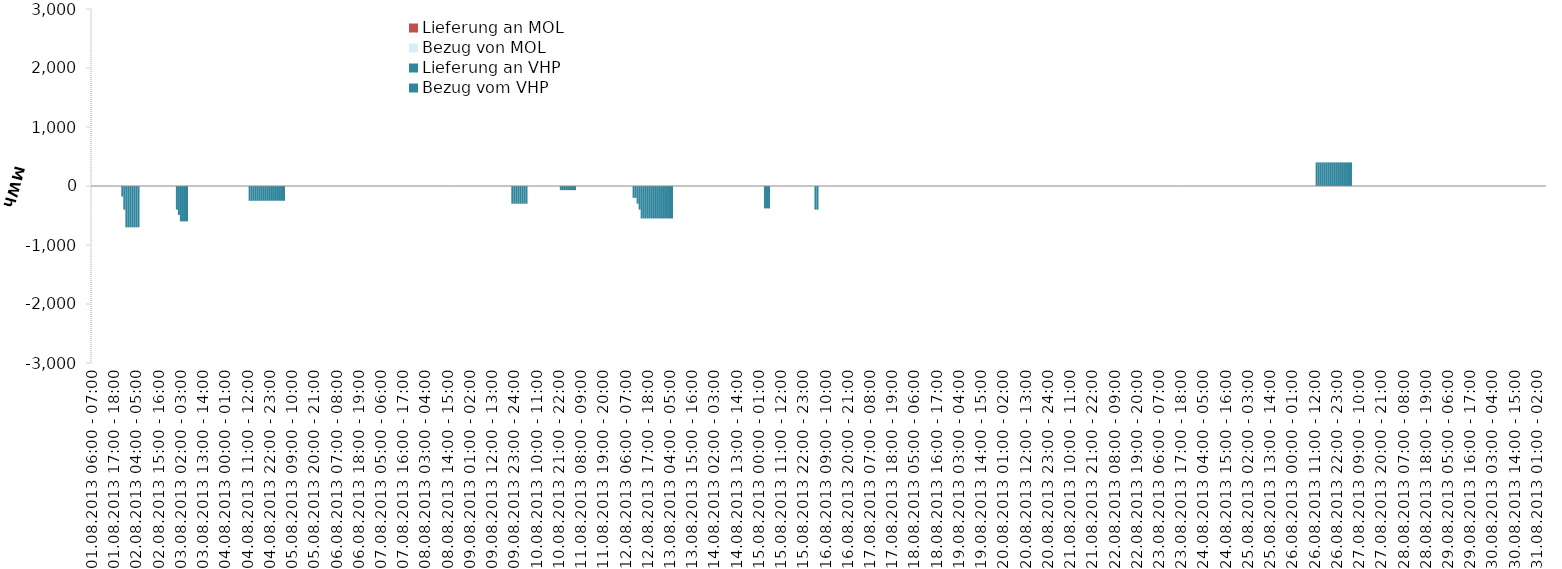
| Category | Bezug vom VHP | Lieferung an VHP | Bezug von MOL | Lieferung an MOL |
|---|---|---|---|---|
| 01.08.2013 06:00 - 07:00 | 0 | 0 | 0 | 0 |
| 01.08.2013 07:00 - 08:00 | 0 | 0 | 0 | 0 |
| 01.08.2013 08:00 - 09:00 | 0 | 0 | 0 | 0 |
| 01.08.2013 09:00 - 10:00 | 0 | 0 | 0 | 0 |
| 01.08.2013 10:00 - 11:00 | 0 | 0 | 0 | 0 |
| 01.08.2013 11:00 - 12:00 | 0 | 0 | 0 | 0 |
| 01.08.2013 12:00 - 13:00 | 0 | 0 | 0 | 0 |
| 01.08.2013 13:00 - 14:00 | 0 | 0 | 0 | 0 |
| 01.08.2013 14:00 - 15:00 | 0 | 0 | 0 | 0 |
| 01.08.2013 15:00 - 16:00 | 0 | 0 | 0 | 0 |
| 01.08.2013 16:00 - 17:00 | 0 | 0 | 0 | 0 |
| 01.08.2013 17:00 - 18:00 | 0 | 0 | 0 | 0 |
| 01.08.2013 18:00 - 19:00 | 0 | 0 | 0 | 0 |
| 01.08.2013 19:00 - 20:00 | 0 | 0 | 0 | 0 |
| 01.08.2013 20:00 - 21:00 | 0 | 0 | 0 | 0 |
| 01.08.2013 21:00 - 22:00 | 0 | -180 | 0 | 0 |
| 01.08.2013 22:00 - 23:00 | 0 | -400 | 0 | 0 |
| 01.08.2013 23:00 - 24:00 | 0 | -700 | 0 | 0 |
| 02.08.2013 00:00 - 01:00 | 0 | -700 | 0 | 0 |
| 02.08.2013 01:00 - 02:00 | 0 | -700 | 0 | 0 |
| 02.08.2013 02:00 - 03:00 | 0 | -700 | 0 | 0 |
| 02.08.2013 03:00 - 04:00 | 0 | -700 | 0 | 0 |
| 02.08.2013 04:00 - 05:00 | 0 | -700 | 0 | 0 |
| 02.08.2013 05:00 - 06:00 | 0 | -700 | 0 | 0 |
| 02.08.2013 06:00 - 07:00 | 0 | 0 | 0 | 0 |
| 02.08.2013 07:00 - 08:00 | 0 | 0 | 0 | 0 |
| 02.08.2013 08:00 - 09:00 | 0 | 0 | 0 | 0 |
| 02.08.2013 09:00 - 10:00 | 0 | 0 | 0 | 0 |
| 02.08.2013 10:00 - 11:00 | 0 | 0 | 0 | 0 |
| 02.08.2013 11:00 - 12:00 | 0 | 0 | 0 | 0 |
| 02.08.2013 12:00 - 13:00 | 0 | 0 | 0 | 0 |
| 02.08.2013 13:00 - 14:00 | 0 | 0 | 0 | 0 |
| 02.08.2013 14:00 - 15:00 | 0 | 0 | 0 | 0 |
| 02.08.2013 15:00 - 16:00 | 0 | 0 | 0 | 0 |
| 02.08.2013 16:00 - 17:00 | 0 | 0 | 0 | 0 |
| 02.08.2013 17:00 - 18:00 | 0 | 0 | 0 | 0 |
| 02.08.2013 18:00 - 19:00 | 0 | 0 | 0 | 0 |
| 02.08.2013 19:00 - 20:00 | 0 | 0 | 0 | 0 |
| 02.08.2013 20:00 - 21:00 | 0 | 0 | 0 | 0 |
| 02.08.2013 21:00 - 22:00 | 0 | 0 | 0 | 0 |
| 02.08.2013 22:00 - 23:00 | 0 | 0 | 0 | 0 |
| 02.08.2013 23:00 - 24:00 | 0 | 0 | 0 | 0 |
| 03.08.2013 00:00 - 01:00 | 0 | -400 | 0 | 0 |
| 03.08.2013 01:00 - 02:00 | 0 | -490 | 0 | 0 |
| 03.08.2013 02:00 - 03:00 | 0 | -600 | 0 | 0 |
| 03.08.2013 03:00 - 04:00 | 0 | -600 | 0 | 0 |
| 03.08.2013 04:00 - 05:00 | 0 | -600 | 0 | 0 |
| 03.08.2013 05:00 - 06:00 | 0 | -600 | 0 | 0 |
| 03.08.2013 06:00 - 07:00 | 0 | 0 | 0 | 0 |
| 03.08.2013 07:00 - 08:00 | 0 | 0 | 0 | 0 |
| 03.08.2013 08:00 - 09:00 | 0 | 0 | 0 | 0 |
| 03.08.2013 09:00 - 10:00 | 0 | 0 | 0 | 0 |
| 03.08.2013 10:00 - 11:00 | 0 | 0 | 0 | 0 |
| 03.08.2013 11:00 - 12:00 | 0 | 0 | 0 | 0 |
| 03.08.2013 12:00 - 13:00 | 0 | 0 | 0 | 0 |
| 03.08.2013 13:00 - 14:00 | 0 | 0 | 0 | 0 |
| 03.08.2013 14:00 - 15:00 | 0 | 0 | 0 | 0 |
| 03.08.2013 15:00 - 16:00 | 0 | 0 | 0 | 0 |
| 03.08.2013 16:00 - 17:00 | 0 | 0 | 0 | 0 |
| 03.08.2013 17:00 - 18:00 | 0 | 0 | 0 | 0 |
| 03.08.2013 18:00 - 19:00 | 0 | 0 | 0 | 0 |
| 03.08.2013 19:00 - 20:00 | 0 | 0 | 0 | 0 |
| 03.08.2013 20:00 - 21:00 | 0 | 0 | 0 | 0 |
| 03.08.2013 21:00 - 22:00 | 0 | 0 | 0 | 0 |
| 03.08.2013 22:00 - 23:00 | 0 | 0 | 0 | 0 |
| 03.08.2013 23:00 - 24:00 | 0 | 0 | 0 | 0 |
| 04.08.2013 00:00 - 01:00 | 0 | 0 | 0 | 0 |
| 04.08.2013 01:00 - 02:00 | 0 | 0 | 0 | 0 |
| 04.08.2013 02:00 - 03:00 | 0 | 0 | 0 | 0 |
| 04.08.2013 03:00 - 04:00 | 0 | 0 | 0 | 0 |
| 04.08.2013 04:00 - 05:00 | 0 | 0 | 0 | 0 |
| 04.08.2013 05:00 - 06:00 | 0 | 0 | 0 | 0 |
| 04.08.2013 06:00 - 07:00 | 0 | 0 | 0 | 0 |
| 04.08.2013 07:00 - 08:00 | 0 | 0 | 0 | 0 |
| 04.08.2013 08:00 - 09:00 | 0 | 0 | 0 | 0 |
| 04.08.2013 09:00 - 10:00 | 0 | 0 | 0 | 0 |
| 04.08.2013 10:00 - 11:00 | 0 | 0 | 0 | 0 |
| 04.08.2013 11:00 - 12:00 | 0 | 0 | 0 | 0 |
| 04.08.2013 12:00 - 13:00 | 0 | -250 | 0 | 0 |
| 04.08.2013 13:00 - 14:00 | 0 | -250 | 0 | 0 |
| 04.08.2013 14:00 - 15:00 | 0 | -250 | 0 | 0 |
| 04.08.2013 15:00 - 16:00 | 0 | -250 | 0 | 0 |
| 04.08.2013 16:00 - 17:00 | 0 | -250 | 0 | 0 |
| 04.08.2013 17:00 - 18:00 | 0 | -250 | 0 | 0 |
| 04.08.2013 18:00 - 19:00 | 0 | -250 | 0 | 0 |
| 04.08.2013 19:00 - 20:00 | 0 | -250 | 0 | 0 |
| 04.08.2013 20:00 - 21:00 | 0 | -250 | 0 | 0 |
| 04.08.2013 21:00 - 22:00 | 0 | -250 | 0 | 0 |
| 04.08.2013 22:00 - 23:00 | 0 | -250 | 0 | 0 |
| 04.08.2013 23:00 - 24:00 | 0 | -250 | 0 | 0 |
| 05.08.2013 00:00 - 01:00 | 0 | -250 | 0 | 0 |
| 05.08.2013 01:00 - 02:00 | 0 | -250 | 0 | 0 |
| 05.08.2013 02:00 - 03:00 | 0 | -250 | 0 | 0 |
| 05.08.2013 03:00 - 04:00 | 0 | -250 | 0 | 0 |
| 05.08.2013 04:00 - 05:00 | 0 | -250 | 0 | 0 |
| 05.08.2013 05:00 - 06:00 | 0 | -250 | 0 | 0 |
| 05.08.2013 06:00 - 07:00 | 0 | 0 | 0 | 0 |
| 05.08.2013 07:00 - 08:00 | 0 | 0 | 0 | 0 |
| 05.08.2013 08:00 - 09:00 | 0 | 0 | 0 | 0 |
| 05.08.2013 09:00 - 10:00 | 0 | 0 | 0 | 0 |
| 05.08.2013 10:00 - 11:00 | 0 | 0 | 0 | 0 |
| 05.08.2013 11:00 - 12:00 | 0 | 0 | 0 | 0 |
| 05.08.2013 12:00 - 13:00 | 0 | 0 | 0 | 0 |
| 05.08.2013 13:00 - 14:00 | 0 | 0 | 0 | 0 |
| 05.08.2013 14:00 - 15:00 | 0 | 0 | 0 | 0 |
| 05.08.2013 15:00 - 16:00 | 0 | 0 | 0 | 0 |
| 05.08.2013 16:00 - 17:00 | 0 | 0 | 0 | 0 |
| 05.08.2013 17:00 - 18:00 | 0 | 0 | 0 | 0 |
| 05.08.2013 18:00 - 19:00 | 0 | 0 | 0 | 0 |
| 05.08.2013 19:00 - 20:00 | 0 | 0 | 0 | 0 |
| 05.08.2013 20:00 - 21:00 | 0 | 0 | 0 | 0 |
| 05.08.2013 21:00 - 22:00 | 0 | 0 | 0 | 0 |
| 05.08.2013 22:00 - 23:00 | 0 | 0 | 0 | 0 |
| 05.08.2013 23:00 - 24:00 | 0 | 0 | 0 | 0 |
| 06.08.2013 00:00 - 01:00 | 0 | 0 | 0 | 0 |
| 06.08.2013 01:00 - 02:00 | 0 | 0 | 0 | 0 |
| 06.08.2013 02:00 - 03:00 | 0 | 0 | 0 | 0 |
| 06.08.2013 03:00 - 04:00 | 0 | 0 | 0 | 0 |
| 06.08.2013 04:00 - 05:00 | 0 | 0 | 0 | 0 |
| 06.08.2013 05:00 - 06:00 | 0 | 0 | 0 | 0 |
| 06.08.2013 06:00 - 07:00 | 0 | 0 | 0 | 0 |
| 06.08.2013 07:00 - 08:00 | 0 | 0 | 0 | 0 |
| 06.08.2013 08:00 - 09:00 | 0 | 0 | 0 | 0 |
| 06.08.2013 09:00 - 10:00 | 0 | 0 | 0 | 0 |
| 06.08.2013 10:00 - 11:00 | 0 | 0 | 0 | 0 |
| 06.08.2013 11:00 - 12:00 | 0 | 0 | 0 | 0 |
| 06.08.2013 12:00 - 13:00 | 0 | 0 | 0 | 0 |
| 06.08.2013 13:00 - 14:00 | 0 | 0 | 0 | 0 |
| 06.08.2013 14:00 - 15:00 | 0 | 0 | 0 | 0 |
| 06.08.2013 15:00 - 16:00 | 0 | 0 | 0 | 0 |
| 06.08.2013 16:00 - 17:00 | 0 | 0 | 0 | 0 |
| 06.08.2013 17:00 - 18:00 | 0 | 0 | 0 | 0 |
| 06.08.2013 18:00 - 19:00 | 0 | 0 | 0 | 0 |
| 06.08.2013 19:00 - 20:00 | 0 | 0 | 0 | 0 |
| 06.08.2013 20:00 - 21:00 | 0 | 0 | 0 | 0 |
| 06.08.2013 21:00 - 22:00 | 0 | 0 | 0 | 0 |
| 06.08.2013 22:00 - 23:00 | 0 | 0 | 0 | 0 |
| 06.08.2013 23:00 - 24:00 | 0 | 0 | 0 | 0 |
| 07.08.2013 00:00 - 01:00 | 0 | 0 | 0 | 0 |
| 07.08.2013 01:00 - 02:00 | 0 | 0 | 0 | 0 |
| 07.08.2013 02:00 - 03:00 | 0 | 0 | 0 | 0 |
| 07.08.2013 03:00 - 04:00 | 0 | 0 | 0 | 0 |
| 07.08.2013 04:00 - 05:00 | 0 | 0 | 0 | 0 |
| 07.08.2013 05:00 - 06:00 | 0 | 0 | 0 | 0 |
| 07.08.2013 06:00 - 07:00 | 0 | 0 | 0 | 0 |
| 07.08.2013 07:00 - 08:00 | 0 | 0 | 0 | 0 |
| 07.08.2013 08:00 - 09:00 | 0 | 0 | 0 | 0 |
| 07.08.2013 09:00 - 10:00 | 0 | 0 | 0 | 0 |
| 07.08.2013 10:00 - 11:00 | 0 | 0 | 0 | 0 |
| 07.08.2013 11:00 - 12:00 | 0 | 0 | 0 | 0 |
| 07.08.2013 12:00 - 13:00 | 0 | 0 | 0 | 0 |
| 07.08.2013 13:00 - 14:00 | 0 | 0 | 0 | 0 |
| 07.08.2013 14:00 - 15:00 | 0 | 0 | 0 | 0 |
| 07.08.2013 15:00 - 16:00 | 0 | 0 | 0 | 0 |
| 07.08.2013 16:00 - 17:00 | 0 | 0 | 0 | 0 |
| 07.08.2013 17:00 - 18:00 | 0 | 0 | 0 | 0 |
| 07.08.2013 18:00 - 19:00 | 0 | 0 | 0 | 0 |
| 07.08.2013 19:00 - 20:00 | 0 | 0 | 0 | 0 |
| 07.08.2013 20:00 - 21:00 | 0 | 0 | 0 | 0 |
| 07.08.2013 21:00 - 22:00 | 0 | 0 | 0 | 0 |
| 07.08.2013 22:00 - 23:00 | 0 | 0 | 0 | 0 |
| 07.08.2013 23:00 - 24:00 | 0 | 0 | 0 | 0 |
| 08.08.2013 00:00 - 01:00 | 0 | 0 | 0 | 0 |
| 08.08.2013 01:00 - 02:00 | 0 | 0 | 0 | 0 |
| 08.08.2013 02:00 - 03:00 | 0 | 0 | 0 | 0 |
| 08.08.2013 03:00 - 04:00 | 0 | 0 | 0 | 0 |
| 08.08.2013 04:00 - 05:00 | 0 | 0 | 0 | 0 |
| 08.08.2013 05:00 - 06:00 | 0 | 0 | 0 | 0 |
| 08.08.2013 06:00 - 07:00 | 0 | 0 | 0 | 0 |
| 08.08.2013 07:00 - 08:00 | 0 | 0 | 0 | 0 |
| 08.08.2013 08:00 - 09:00 | 0 | 0 | 0 | 0 |
| 08.08.2013 09:00 - 10:00 | 0 | 0 | 0 | 0 |
| 08.08.2013 10:00 - 11:00 | 0 | 0 | 0 | 0 |
| 08.08.2013 11:00 - 12:00 | 0 | 0 | 0 | 0 |
| 08.08.2013 12:00 - 13:00 | 0 | 0 | 0 | 0 |
| 08.08.2013 13:00 - 14:00 | 0 | 0 | 0 | 0 |
| 08.08.2013 14:00 - 15:00 | 0 | 0 | 0 | 0 |
| 08.08.2013 15:00 - 16:00 | 0 | 0 | 0 | 0 |
| 08.08.2013 16:00 - 17:00 | 0 | 0 | 0 | 0 |
| 08.08.2013 17:00 - 18:00 | 0 | 0 | 0 | 0 |
| 08.08.2013 18:00 - 19:00 | 0 | 0 | 0 | 0 |
| 08.08.2013 19:00 - 20:00 | 0 | 0 | 0 | 0 |
| 08.08.2013 20:00 - 21:00 | 0 | 0 | 0 | 0 |
| 08.08.2013 21:00 - 22:00 | 0 | 0 | 0 | 0 |
| 08.08.2013 22:00 - 23:00 | 0 | 0 | 0 | 0 |
| 08.08.2013 23:00 - 24:00 | 0 | 0 | 0 | 0 |
| 09.08.2013 00:00 - 01:00 | 0 | 0 | 0 | 0 |
| 09.08.2013 01:00 - 02:00 | 0 | 0 | 0 | 0 |
| 09.08.2013 02:00 - 03:00 | 0 | 0 | 0 | 0 |
| 09.08.2013 03:00 - 04:00 | 0 | 0 | 0 | 0 |
| 09.08.2013 04:00 - 05:00 | 0 | 0 | 0 | 0 |
| 09.08.2013 05:00 - 06:00 | 0 | 0 | 0 | 0 |
| 09.08.2013 06:00 - 07:00 | 0 | 0 | 0 | 0 |
| 09.08.2013 07:00 - 08:00 | 0 | 0 | 0 | 0 |
| 09.08.2013 08:00 - 09:00 | 0 | 0 | 0 | 0 |
| 09.08.2013 09:00 - 10:00 | 0 | 0 | 0 | 0 |
| 09.08.2013 10:00 - 11:00 | 0 | 0 | 0 | 0 |
| 09.08.2013 11:00 - 12:00 | 0 | 0 | 0 | 0 |
| 09.08.2013 12:00 - 13:00 | 0 | 0 | 0 | 0 |
| 09.08.2013 13:00 - 14:00 | 0 | 0 | 0 | 0 |
| 09.08.2013 14:00 - 15:00 | 0 | 0 | 0 | 0 |
| 09.08.2013 15:00 - 16:00 | 0 | 0 | 0 | 0 |
| 09.08.2013 16:00 - 17:00 | 0 | 0 | 0 | 0 |
| 09.08.2013 17:00 - 18:00 | 0 | 0 | 0 | 0 |
| 09.08.2013 18:00 - 19:00 | 0 | 0 | 0 | 0 |
| 09.08.2013 19:00 - 20:00 | 0 | 0 | 0 | 0 |
| 09.08.2013 20:00 - 21:00 | 0 | 0 | 0 | 0 |
| 09.08.2013 21:00 - 22:00 | 0 | 0 | 0 | 0 |
| 09.08.2013 22:00 - 23:00 | 0 | -300 | 0 | 0 |
| 09.08.2013 23:00 - 24:00 | 0 | -300 | 0 | 0 |
| 10.08.2013 00:00 - 01:00 | 0 | -300 | 0 | 0 |
| 10.08.2013 01:00 - 02:00 | 0 | -300 | 0 | 0 |
| 10.08.2013 02:00 - 03:00 | 0 | -300 | 0 | 0 |
| 10.08.2013 03:00 - 04:00 | 0 | -300 | 0 | 0 |
| 10.08.2013 04:00 - 05:00 | 0 | -300 | 0 | 0 |
| 10.08.2013 05:00 - 06:00 | 0 | -300 | 0 | 0 |
| 10.08.2013 06:00 - 07:00 | 0 | 0 | 0 | 0 |
| 10.08.2013 07:00 - 08:00 | 0 | 0 | 0 | 0 |
| 10.08.2013 08:00 - 09:00 | 0 | 0 | 0 | 0 |
| 10.08.2013 09:00 - 10:00 | 0 | 0 | 0 | 0 |
| 10.08.2013 10:00 - 11:00 | 0 | 0 | 0 | 0 |
| 10.08.2013 11:00 - 12:00 | 0 | 0 | 0 | 0 |
| 10.08.2013 12:00 - 13:00 | 0 | 0 | 0 | 0 |
| 10.08.2013 13:00 - 14:00 | 0 | 0 | 0 | 0 |
| 10.08.2013 14:00 - 15:00 | 0 | 0 | 0 | 0 |
| 10.08.2013 15:00 - 16:00 | 0 | 0 | 0 | 0 |
| 10.08.2013 16:00 - 17:00 | 0 | 0 | 0 | 0 |
| 10.08.2013 17:00 - 18:00 | 0 | 0 | 0 | 0 |
| 10.08.2013 18:00 - 19:00 | 0 | 0 | 0 | 0 |
| 10.08.2013 19:00 - 20:00 | 0 | 0 | 0 | 0 |
| 10.08.2013 20:00 - 21:00 | 0 | 0 | 0 | 0 |
| 10.08.2013 21:00 - 22:00 | 0 | 0 | 0 | 0 |
| 10.08.2013 22:00 - 23:00 | 0 | -70 | 0 | 0 |
| 10.08.2013 23:00 - 24:00 | 0 | -70 | 0 | 0 |
| 11.08.2013 00:00 - 01:00 | 0 | -70 | 0 | 0 |
| 11.08.2013 01:00 - 02:00 | 0 | -70 | 0 | 0 |
| 11.08.2013 02:00 - 03:00 | 0 | -70 | 0 | 0 |
| 11.08.2013 03:00 - 04:00 | 0 | -70 | 0 | 0 |
| 11.08.2013 04:00 - 05:00 | 0 | -70 | 0 | 0 |
| 11.08.2013 05:00 - 06:00 | 0 | -70 | 0 | 0 |
| 11.08.2013 06:00 - 07:00 | 0 | 0 | 0 | 0 |
| 11.08.2013 07:00 - 08:00 | 0 | 0 | 0 | 0 |
| 11.08.2013 08:00 - 09:00 | 0 | 0 | 0 | 0 |
| 11.08.2013 09:00 - 10:00 | 0 | 0 | 0 | 0 |
| 11.08.2013 10:00 - 11:00 | 0 | 0 | 0 | 0 |
| 11.08.2013 11:00 - 12:00 | 0 | 0 | 0 | 0 |
| 11.08.2013 12:00 - 13:00 | 0 | 0 | 0 | 0 |
| 11.08.2013 13:00 - 14:00 | 0 | 0 | 0 | 0 |
| 11.08.2013 14:00 - 15:00 | 0 | 0 | 0 | 0 |
| 11.08.2013 15:00 - 16:00 | 0 | 0 | 0 | 0 |
| 11.08.2013 16:00 - 17:00 | 0 | 0 | 0 | 0 |
| 11.08.2013 17:00 - 18:00 | 0 | 0 | 0 | 0 |
| 11.08.2013 18:00 - 19:00 | 0 | 0 | 0 | 0 |
| 11.08.2013 19:00 - 20:00 | 0 | 0 | 0 | 0 |
| 11.08.2013 20:00 - 21:00 | 0 | 0 | 0 | 0 |
| 11.08.2013 21:00 - 22:00 | 0 | 0 | 0 | 0 |
| 11.08.2013 22:00 - 23:00 | 0 | 0 | 0 | 0 |
| 11.08.2013 23:00 - 24:00 | 0 | 0 | 0 | 0 |
| 12.08.2013 00:00 - 01:00 | 0 | 0 | 0 | 0 |
| 12.08.2013 01:00 - 02:00 | 0 | 0 | 0 | 0 |
| 12.08.2013 02:00 - 03:00 | 0 | 0 | 0 | 0 |
| 12.08.2013 03:00 - 04:00 | 0 | 0 | 0 | 0 |
| 12.08.2013 04:00 - 05:00 | 0 | 0 | 0 | 0 |
| 12.08.2013 05:00 - 06:00 | 0 | 0 | 0 | 0 |
| 12.08.2013 06:00 - 07:00 | 0 | 0 | 0 | 0 |
| 12.08.2013 07:00 - 08:00 | 0 | 0 | 0 | 0 |
| 12.08.2013 08:00 - 09:00 | 0 | 0 | 0 | 0 |
| 12.08.2013 09:00 - 10:00 | 0 | 0 | 0 | 0 |
| 12.08.2013 10:00 - 11:00 | 0 | -200 | 0 | 0 |
| 12.08.2013 11:00 - 12:00 | 0 | -200 | 0 | 0 |
| 12.08.2013 12:00 - 13:00 | 0 | -300 | 0 | 0 |
| 12.08.2013 13:00 - 14:00 | 0 | -400 | 0 | 0 |
| 12.08.2013 14:00 - 15:00 | 0 | -550 | 0 | 0 |
| 12.08.2013 15:00 - 16:00 | 0 | -550 | 0 | 0 |
| 12.08.2013 16:00 - 17:00 | 0 | -550 | 0 | 0 |
| 12.08.2013 17:00 - 18:00 | 0 | -550 | 0 | 0 |
| 12.08.2013 18:00 - 19:00 | 0 | -550 | 0 | 0 |
| 12.08.2013 19:00 - 20:00 | 0 | -550 | 0 | 0 |
| 12.08.2013 20:00 - 21:00 | 0 | -550 | 0 | 0 |
| 12.08.2013 21:00 - 22:00 | 0 | -550 | 0 | 0 |
| 12.08.2013 22:00 - 23:00 | 0 | -550 | 0 | 0 |
| 12.08.2013 23:00 - 24:00 | 0 | -550 | 0 | 0 |
| 13.08.2013 00:00 - 01:00 | 0 | -550 | 0 | 0 |
| 13.08.2013 01:00 - 02:00 | 0 | -550 | 0 | 0 |
| 13.08.2013 02:00 - 03:00 | 0 | -550 | 0 | 0 |
| 13.08.2013 03:00 - 04:00 | 0 | -550 | 0 | 0 |
| 13.08.2013 04:00 - 05:00 | 0 | -550 | 0 | 0 |
| 13.08.2013 05:00 - 06:00 | 0 | -550 | 0 | 0 |
| 13.08.2013 06:00 - 07:00 | 0 | 0 | 0 | 0 |
| 13.08.2013 07:00 - 08:00 | 0 | 0 | 0 | 0 |
| 13.08.2013 08:00 - 09:00 | 0 | 0 | 0 | 0 |
| 13.08.2013 09:00 - 10:00 | 0 | 0 | 0 | 0 |
| 13.08.2013 10:00 - 11:00 | 0 | 0 | 0 | 0 |
| 13.08.2013 11:00 - 12:00 | 0 | 0 | 0 | 0 |
| 13.08.2013 12:00 - 13:00 | 0 | 0 | 0 | 0 |
| 13.08.2013 13:00 - 14:00 | 0 | 0 | 0 | 0 |
| 13.08.2013 14:00 - 15:00 | 0 | 0 | 0 | 0 |
| 13.08.2013 15:00 - 16:00 | 0 | 0 | 0 | 0 |
| 13.08.2013 16:00 - 17:00 | 0 | 0 | 0 | 0 |
| 13.08.2013 17:00 - 18:00 | 0 | 0 | 0 | 0 |
| 13.08.2013 18:00 - 19:00 | 0 | 0 | 0 | 0 |
| 13.08.2013 19:00 - 20:00 | 0 | 0 | 0 | 0 |
| 13.08.2013 20:00 - 21:00 | 0 | 0 | 0 | 0 |
| 13.08.2013 21:00 - 22:00 | 0 | 0 | 0 | 0 |
| 13.08.2013 22:00 - 23:00 | 0 | 0 | 0 | 0 |
| 13.08.2013 23:00 - 24:00 | 0 | 0 | 0 | 0 |
| 14.08.2013 00:00 - 01:00 | 0 | 0 | 0 | 0 |
| 14.08.2013 01:00 - 02:00 | 0 | 0 | 0 | 0 |
| 14.08.2013 02:00 - 03:00 | 0 | 0 | 0 | 0 |
| 14.08.2013 03:00 - 04:00 | 0 | 0 | 0 | 0 |
| 14.08.2013 04:00 - 05:00 | 0 | 0 | 0 | 0 |
| 14.08.2013 05:00 - 06:00 | 0 | 0 | 0 | 0 |
| 14.08.2013 06:00 - 07:00 | 0 | 0 | 0 | 0 |
| 14.08.2013 07:00 - 08:00 | 0 | 0 | 0 | 0 |
| 14.08.2013 08:00 - 09:00 | 0 | 0 | 0 | 0 |
| 14.08.2013 09:00 - 10:00 | 0 | 0 | 0 | 0 |
| 14.08.2013 10:00 - 11:00 | 0 | 0 | 0 | 0 |
| 14.08.2013 11:00 - 12:00 | 0 | 0 | 0 | 0 |
| 14.08.2013 12:00 - 13:00 | 0 | 0 | 0 | 0 |
| 14.08.2013 13:00 - 14:00 | 0 | 0 | 0 | 0 |
| 14.08.2013 14:00 - 15:00 | 0 | 0 | 0 | 0 |
| 14.08.2013 15:00 - 16:00 | 0 | 0 | 0 | 0 |
| 14.08.2013 16:00 - 17:00 | 0 | 0 | 0 | 0 |
| 14.08.2013 17:00 - 18:00 | 0 | 0 | 0 | 0 |
| 14.08.2013 18:00 - 19:00 | 0 | 0 | 0 | 0 |
| 14.08.2013 19:00 - 20:00 | 0 | 0 | 0 | 0 |
| 14.08.2013 20:00 - 21:00 | 0 | 0 | 0 | 0 |
| 14.08.2013 21:00 - 22:00 | 0 | 0 | 0 | 0 |
| 14.08.2013 22:00 - 23:00 | 0 | 0 | 0 | 0 |
| 14.08.2013 23:00 - 24:00 | 0 | 0 | 0 | 0 |
| 15.08.2013 00:00 - 01:00 | 0 | 0 | 0 | 0 |
| 15.08.2013 01:00 - 02:00 | 0 | 0 | 0 | 0 |
| 15.08.2013 02:00 - 03:00 | 0 | 0 | 0 | 0 |
| 15.08.2013 03:00 - 04:00 | 0 | -380 | 0 | 0 |
| 15.08.2013 04:00 - 05:00 | 0 | -380 | 0 | 0 |
| 15.08.2013 05:00 - 06:00 | 0 | -380 | 0 | 0 |
| 15.08.2013 06:00 - 07:00 | 0 | 0 | 0 | 0 |
| 15.08.2013 07:00 - 08:00 | 0 | 0 | 0 | 0 |
| 15.08.2013 08:00 - 09:00 | 0 | 0 | 0 | 0 |
| 15.08.2013 09:00 - 10:00 | 0 | 0 | 0 | 0 |
| 15.08.2013 10:00 - 11:00 | 0 | 0 | 0 | 0 |
| 15.08.2013 11:00 - 12:00 | 0 | 0 | 0 | 0 |
| 15.08.2013 12:00 - 13:00 | 0 | 0 | 0 | 0 |
| 15.08.2013 13:00 - 14:00 | 0 | 0 | 0 | 0 |
| 15.08.2013 14:00 - 15:00 | 0 | 0 | 0 | 0 |
| 15.08.2013 15:00 - 16:00 | 0 | 0 | 0 | 0 |
| 15.08.2013 16:00 - 17:00 | 0 | 0 | 0 | 0 |
| 15.08.2013 17:00 - 18:00 | 0 | 0 | 0 | 0 |
| 15.08.2013 18:00 - 19:00 | 0 | 0 | 0 | 0 |
| 15.08.2013 19:00 - 20:00 | 0 | 0 | 0 | 0 |
| 15.08.2013 20:00 - 21:00 | 0 | 0 | 0 | 0 |
| 15.08.2013 21:00 - 22:00 | 0 | 0 | 0 | 0 |
| 15.08.2013 22:00 - 23:00 | 0 | 0 | 0 | 0 |
| 15.08.2013 23:00 - 24:00 | 0 | 0 | 0 | 0 |
| 16.08.2013 00:00 - 01:00 | 0 | 0 | 0 | 0 |
| 16.08.2013 01:00 - 02:00 | 0 | 0 | 0 | 0 |
| 16.08.2013 02:00 - 03:00 | 0 | 0 | 0 | 0 |
| 16.08.2013 03:00 - 04:00 | 0 | 0 | 0 | 0 |
| 16.08.2013 04:00 - 05:00 | 0 | -400 | 0 | 0 |
| 16.08.2013 05:00 - 06:00 | 0 | -400 | 0 | 0 |
| 16.08.2013 06:00 - 07:00 | 0 | 0 | 0 | 0 |
| 16.08.2013 07:00 - 08:00 | 0 | 0 | 0 | 0 |
| 16.08.2013 08:00 - 09:00 | 0 | 0 | 0 | 0 |
| 16.08.2013 09:00 - 10:00 | 0 | 0 | 0 | 0 |
| 16.08.2013 10:00 - 11:00 | 0 | 0 | 0 | 0 |
| 16.08.2013 11:00 - 12:00 | 0 | 0 | 0 | 0 |
| 16.08.2013 12:00 - 13:00 | 0 | 0 | 0 | 0 |
| 16.08.2013 13:00 - 14:00 | 0 | 0 | 0 | 0 |
| 16.08.2013 14:00 - 15:00 | 0 | 0 | 0 | 0 |
| 16.08.2013 15:00 - 16:00 | 0 | 0 | 0 | 0 |
| 16.08.2013 16:00 - 17:00 | 0 | 0 | 0 | 0 |
| 16.08.2013 17:00 - 18:00 | 0 | 0 | 0 | 0 |
| 16.08.2013 18:00 - 19:00 | 0 | 0 | 0 | 0 |
| 16.08.2013 19:00 - 20:00 | 0 | 0 | 0 | 0 |
| 16.08.2013 20:00 - 21:00 | 0 | 0 | 0 | 0 |
| 16.08.2013 21:00 - 22:00 | 0 | 0 | 0 | 0 |
| 16.08.2013 22:00 - 23:00 | 0 | 0 | 0 | 0 |
| 16.08.2013 23:00 - 24:00 | 0 | 0 | 0 | 0 |
| 17.08.2013 00:00 - 01:00 | 0 | 0 | 0 | 0 |
| 17.08.2013 01:00 - 02:00 | 0 | 0 | 0 | 0 |
| 17.08.2013 02:00 - 03:00 | 0 | 0 | 0 | 0 |
| 17.08.2013 03:00 - 04:00 | 0 | 0 | 0 | 0 |
| 17.08.2013 04:00 - 05:00 | 0 | 0 | 0 | 0 |
| 17.08.2013 05:00 - 06:00 | 0 | 0 | 0 | 0 |
| 17.08.2013 06:00 - 07:00 | 0 | 0 | 0 | 0 |
| 17.08.2013 07:00 - 08:00 | 0 | 0 | 0 | 0 |
| 17.08.2013 08:00 - 09:00 | 0 | 0 | 0 | 0 |
| 17.08.2013 09:00 - 10:00 | 0 | 0 | 0 | 0 |
| 17.08.2013 10:00 - 11:00 | 0 | 0 | 0 | 0 |
| 17.08.2013 11:00 - 12:00 | 0 | 0 | 0 | 0 |
| 17.08.2013 12:00 - 13:00 | 0 | 0 | 0 | 0 |
| 17.08.2013 13:00 - 14:00 | 0 | 0 | 0 | 0 |
| 17.08.2013 14:00 - 15:00 | 0 | 0 | 0 | 0 |
| 17.08.2013 15:00 - 16:00 | 0 | 0 | 0 | 0 |
| 17.08.2013 16:00 - 17:00 | 0 | 0 | 0 | 0 |
| 17.08.2013 17:00 - 18:00 | 0 | 0 | 0 | 0 |
| 17.08.2013 18:00 - 19:00 | 0 | 0 | 0 | 0 |
| 17.08.2013 19:00 - 20:00 | 0 | 0 | 0 | 0 |
| 17.08.2013 20:00 - 21:00 | 0 | 0 | 0 | 0 |
| 17.08.2013 21:00 - 22:00 | 0 | 0 | 0 | 0 |
| 17.08.2013 22:00 - 23:00 | 0 | 0 | 0 | 0 |
| 17.08.2013 23:00 - 24:00 | 0 | 0 | 0 | 0 |
| 18.08.2013 00:00 - 01:00 | 0 | 0 | 0 | 0 |
| 18.08.2013 01:00 - 02:00 | 0 | 0 | 0 | 0 |
| 18.08.2013 02:00 - 03:00 | 0 | 0 | 0 | 0 |
| 18.08.2013 03:00 - 04:00 | 0 | 0 | 0 | 0 |
| 18.08.2013 04:00 - 05:00 | 0 | 0 | 0 | 0 |
| 18.08.2013 05:00 - 06:00 | 0 | 0 | 0 | 0 |
| 18.08.2013 06:00 - 07:00 | 0 | 0 | 0 | 0 |
| 18.08.2013 07:00 - 08:00 | 0 | 0 | 0 | 0 |
| 18.08.2013 08:00 - 09:00 | 0 | 0 | 0 | 0 |
| 18.08.2013 09:00 - 10:00 | 0 | 0 | 0 | 0 |
| 18.08.2013 10:00 - 11:00 | 0 | 0 | 0 | 0 |
| 18.08.2013 11:00 - 12:00 | 0 | 0 | 0 | 0 |
| 18.08.2013 12:00 - 13:00 | 0 | 0 | 0 | 0 |
| 18.08.2013 13:00 - 14:00 | 0 | 0 | 0 | 0 |
| 18.08.2013 14:00 - 15:00 | 0 | 0 | 0 | 0 |
| 18.08.2013 15:00 - 16:00 | 0 | 0 | 0 | 0 |
| 18.08.2013 16:00 - 17:00 | 0 | 0 | 0 | 0 |
| 18.08.2013 17:00 - 18:00 | 0 | 0 | 0 | 0 |
| 18.08.2013 18:00 - 19:00 | 0 | 0 | 0 | 0 |
| 18.08.2013 19:00 - 20:00 | 0 | 0 | 0 | 0 |
| 18.08.2013 20:00 - 21:00 | 0 | 0 | 0 | 0 |
| 18.08.2013 21:00 - 22:00 | 0 | 0 | 0 | 0 |
| 18.08.2013 22:00 - 23:00 | 0 | 0 | 0 | 0 |
| 18.08.2013 23:00 - 24:00 | 0 | 0 | 0 | 0 |
| 19.08.2013 00:00 - 01:00 | 0 | 0 | 0 | 0 |
| 19.08.2013 01:00 - 02:00 | 0 | 0 | 0 | 0 |
| 19.08.2013 02:00 - 03:00 | 0 | 0 | 0 | 0 |
| 19.08.2013 03:00 - 04:00 | 0 | 0 | 0 | 0 |
| 19.08.2013 04:00 - 05:00 | 0 | 0 | 0 | 0 |
| 19.08.2013 05:00 - 06:00 | 0 | 0 | 0 | 0 |
| 19.08.2013 06:00 - 07:00 | 0 | 0 | 0 | 0 |
| 19.08.2013 07:00 - 08:00 | 0 | 0 | 0 | 0 |
| 19.08.2013 08:00 - 09:00 | 0 | 0 | 0 | 0 |
| 19.08.2013 09:00 - 10:00 | 0 | 0 | 0 | 0 |
| 19.08.2013 10:00 - 11:00 | 0 | 0 | 0 | 0 |
| 19.08.2013 11:00 - 12:00 | 0 | 0 | 0 | 0 |
| 19.08.2013 12:00 - 13:00 | 0 | 0 | 0 | 0 |
| 19.08.2013 13:00 - 14:00 | 0 | 0 | 0 | 0 |
| 19.08.2013 14:00 - 15:00 | 0 | 0 | 0 | 0 |
| 19.08.2013 15:00 - 16:00 | 0 | 0 | 0 | 0 |
| 19.08.2013 16:00 - 17:00 | 0 | 0 | 0 | 0 |
| 19.08.2013 17:00 - 18:00 | 0 | 0 | 0 | 0 |
| 19.08.2013 18:00 - 19:00 | 0 | 0 | 0 | 0 |
| 19.08.2013 19:00 - 20:00 | 0 | 0 | 0 | 0 |
| 19.08.2013 20:00 - 21:00 | 0 | 0 | 0 | 0 |
| 19.08.2013 21:00 - 22:00 | 0 | 0 | 0 | 0 |
| 19.08.2013 22:00 - 23:00 | 0 | 0 | 0 | 0 |
| 19.08.2013 23:00 - 24:00 | 0 | 0 | 0 | 0 |
| 20.08.2013 00:00 - 01:00 | 0 | 0 | 0 | 0 |
| 20.08.2013 01:00 - 02:00 | 0 | 0 | 0 | 0 |
| 20.08.2013 02:00 - 03:00 | 0 | 0 | 0 | 0 |
| 20.08.2013 03:00 - 04:00 | 0 | 0 | 0 | 0 |
| 20.08.2013 04:00 - 05:00 | 0 | 0 | 0 | 0 |
| 20.08.2013 05:00 - 06:00 | 0 | 0 | 0 | 0 |
| 20.08.2013 06:00 - 07:00 | 0 | 0 | 0 | 0 |
| 20.08.2013 07:00 - 08:00 | 0 | 0 | 0 | 0 |
| 20.08.2013 08:00 - 09:00 | 0 | 0 | 0 | 0 |
| 20.08.2013 09:00 - 10:00 | 0 | 0 | 0 | 0 |
| 20.08.2013 10:00 - 11:00 | 0 | 0 | 0 | 0 |
| 20.08.2013 11:00 - 12:00 | 0 | 0 | 0 | 0 |
| 20.08.2013 12:00 - 13:00 | 0 | 0 | 0 | 0 |
| 20.08.2013 13:00 - 14:00 | 0 | 0 | 0 | 0 |
| 20.08.2013 14:00 - 15:00 | 0 | 0 | 0 | 0 |
| 20.08.2013 15:00 - 16:00 | 0 | 0 | 0 | 0 |
| 20.08.2013 16:00 - 17:00 | 0 | 0 | 0 | 0 |
| 20.08.2013 17:00 - 18:00 | 0 | 0 | 0 | 0 |
| 20.08.2013 18:00 - 19:00 | 0 | 0 | 0 | 0 |
| 20.08.2013 19:00 - 20:00 | 0 | 0 | 0 | 0 |
| 20.08.2013 20:00 - 21:00 | 0 | 0 | 0 | 0 |
| 20.08.2013 21:00 - 22:00 | 0 | 0 | 0 | 0 |
| 20.08.2013 22:00 - 23:00 | 0 | 0 | 0 | 0 |
| 20.08.2013 23:00 - 24:00 | 0 | 0 | 0 | 0 |
| 21.08.2013 00:00 - 01:00 | 0 | 0 | 0 | 0 |
| 21.08.2013 01:00 - 02:00 | 0 | 0 | 0 | 0 |
| 21.08.2013 02:00 - 03:00 | 0 | 0 | 0 | 0 |
| 21.08.2013 03:00 - 04:00 | 0 | 0 | 0 | 0 |
| 21.08.2013 04:00 - 05:00 | 0 | 0 | 0 | 0 |
| 21.08.2013 05:00 - 06:00 | 0 | 0 | 0 | 0 |
| 21.08.2013 06:00 - 07:00 | 0 | 0 | 0 | 0 |
| 21.08.2013 07:00 - 08:00 | 0 | 0 | 0 | 0 |
| 21.08.2013 08:00 - 09:00 | 0 | 0 | 0 | 0 |
| 21.08.2013 09:00 - 10:00 | 0 | 0 | 0 | 0 |
| 21.08.2013 10:00 - 11:00 | 0 | 0 | 0 | 0 |
| 21.08.2013 11:00 - 12:00 | 0 | 0 | 0 | 0 |
| 21.08.2013 12:00 - 13:00 | 0 | 0 | 0 | 0 |
| 21.08.2013 13:00 - 14:00 | 0 | 0 | 0 | 0 |
| 21.08.2013 14:00 - 15:00 | 0 | 0 | 0 | 0 |
| 21.08.2013 15:00 - 16:00 | 0 | 0 | 0 | 0 |
| 21.08.2013 16:00 - 17:00 | 0 | 0 | 0 | 0 |
| 21.08.2013 17:00 - 18:00 | 0 | 0 | 0 | 0 |
| 21.08.2013 18:00 - 19:00 | 0 | 0 | 0 | 0 |
| 21.08.2013 19:00 - 20:00 | 0 | 0 | 0 | 0 |
| 21.08.2013 20:00 - 21:00 | 0 | 0 | 0 | 0 |
| 21.08.2013 21:00 - 22:00 | 0 | 0 | 0 | 0 |
| 21.08.2013 22:00 - 23:00 | 0 | 0 | 0 | 0 |
| 21.08.2013 23:00 - 24:00 | 0 | 0 | 0 | 0 |
| 22.08.2013 00:00 - 01:00 | 0 | 0 | 0 | 0 |
| 22.08.2013 01:00 - 02:00 | 0 | 0 | 0 | 0 |
| 22.08.2013 02:00 - 03:00 | 0 | 0 | 0 | 0 |
| 22.08.2013 03:00 - 04:00 | 0 | 0 | 0 | 0 |
| 22.08.2013 04:00 - 05:00 | 0 | 0 | 0 | 0 |
| 22.08.2013 05:00 - 06:00 | 0 | 0 | 0 | 0 |
| 22.08.2013 06:00 - 07:00 | 0 | 0 | 0 | 0 |
| 22.08.2013 07:00 - 08:00 | 0 | 0 | 0 | 0 |
| 22.08.2013 08:00 - 09:00 | 0 | 0 | 0 | 0 |
| 22.08.2013 09:00 - 10:00 | 0 | 0 | 0 | 0 |
| 22.08.2013 10:00 - 11:00 | 0 | 0 | 0 | 0 |
| 22.08.2013 11:00 - 12:00 | 0 | 0 | 0 | 0 |
| 22.08.2013 12:00 - 13:00 | 0 | 0 | 0 | 0 |
| 22.08.2013 13:00 - 14:00 | 0 | 0 | 0 | 0 |
| 22.08.2013 14:00 - 15:00 | 0 | 0 | 0 | 0 |
| 22.08.2013 15:00 - 16:00 | 0 | 0 | 0 | 0 |
| 22.08.2013 16:00 - 17:00 | 0 | 0 | 0 | 0 |
| 22.08.2013 17:00 - 18:00 | 0 | 0 | 0 | 0 |
| 22.08.2013 18:00 - 19:00 | 0 | 0 | 0 | 0 |
| 22.08.2013 19:00 - 20:00 | 0 | 0 | 0 | 0 |
| 22.08.2013 20:00 - 21:00 | 0 | 0 | 0 | 0 |
| 22.08.2013 21:00 - 22:00 | 0 | 0 | 0 | 0 |
| 22.08.2013 22:00 - 23:00 | 0 | 0 | 0 | 0 |
| 22.08.2013 23:00 - 24:00 | 0 | 0 | 0 | 0 |
| 23.08.2013 00:00 - 01:00 | 0 | 0 | 0 | 0 |
| 23.08.2013 01:00 - 02:00 | 0 | 0 | 0 | 0 |
| 23.08.2013 02:00 - 03:00 | 0 | 0 | 0 | 0 |
| 23.08.2013 03:00 - 04:00 | 0 | 0 | 0 | 0 |
| 23.08.2013 04:00 - 05:00 | 0 | 0 | 0 | 0 |
| 23.08.2013 05:00 - 06:00 | 0 | 0 | 0 | 0 |
| 23.08.2013 06:00 - 07:00 | 0 | 0 | 0 | 0 |
| 23.08.2013 07:00 - 08:00 | 0 | 0 | 0 | 0 |
| 23.08.2013 08:00 - 09:00 | 0 | 0 | 0 | 0 |
| 23.08.2013 09:00 - 10:00 | 0 | 0 | 0 | 0 |
| 23.08.2013 10:00 - 11:00 | 0 | 0 | 0 | 0 |
| 23.08.2013 11:00 - 12:00 | 0 | 0 | 0 | 0 |
| 23.08.2013 12:00 - 13:00 | 0 | 0 | 0 | 0 |
| 23.08.2013 13:00 - 14:00 | 0 | 0 | 0 | 0 |
| 23.08.2013 14:00 - 15:00 | 0 | 0 | 0 | 0 |
| 23.08.2013 15:00 - 16:00 | 0 | 0 | 0 | 0 |
| 23.08.2013 16:00 - 17:00 | 0 | 0 | 0 | 0 |
| 23.08.2013 17:00 - 18:00 | 0 | 0 | 0 | 0 |
| 23.08.2013 18:00 - 19:00 | 0 | 0 | 0 | 0 |
| 23.08.2013 19:00 - 20:00 | 0 | 0 | 0 | 0 |
| 23.08.2013 20:00 - 21:00 | 0 | 0 | 0 | 0 |
| 23.08.2013 21:00 - 22:00 | 0 | 0 | 0 | 0 |
| 23.08.2013 22:00 - 23:00 | 0 | 0 | 0 | 0 |
| 23.08.2013 23:00 - 24:00 | 0 | 0 | 0 | 0 |
| 24.08.2013 00:00 - 01:00 | 0 | 0 | 0 | 0 |
| 24.08.2013 01:00 - 02:00 | 0 | 0 | 0 | 0 |
| 24.08.2013 02:00 - 03:00 | 0 | 0 | 0 | 0 |
| 24.08.2013 03:00 - 04:00 | 0 | 0 | 0 | 0 |
| 24.08.2013 04:00 - 05:00 | 0 | 0 | 0 | 0 |
| 24.08.2013 05:00 - 06:00 | 0 | 0 | 0 | 0 |
| 24.08.2013 06:00 - 07:00 | 0 | 0 | 0 | 0 |
| 24.08.2013 07:00 - 08:00 | 0 | 0 | 0 | 0 |
| 24.08.2013 08:00 - 09:00 | 0 | 0 | 0 | 0 |
| 24.08.2013 09:00 - 10:00 | 0 | 0 | 0 | 0 |
| 24.08.2013 10:00 - 11:00 | 0 | 0 | 0 | 0 |
| 24.08.2013 11:00 - 12:00 | 0 | 0 | 0 | 0 |
| 24.08.2013 12:00 - 13:00 | 0 | 0 | 0 | 0 |
| 24.08.2013 13:00 - 14:00 | 0 | 0 | 0 | 0 |
| 24.08.2013 14:00 - 15:00 | 0 | 0 | 0 | 0 |
| 24.08.2013 15:00 - 16:00 | 0 | 0 | 0 | 0 |
| 24.08.2013 16:00 - 17:00 | 0 | 0 | 0 | 0 |
| 24.08.2013 17:00 - 18:00 | 0 | 0 | 0 | 0 |
| 24.08.2013 18:00 - 19:00 | 0 | 0 | 0 | 0 |
| 24.08.2013 19:00 - 20:00 | 0 | 0 | 0 | 0 |
| 24.08.2013 20:00 - 21:00 | 0 | 0 | 0 | 0 |
| 24.08.2013 21:00 - 22:00 | 0 | 0 | 0 | 0 |
| 24.08.2013 22:00 - 23:00 | 0 | 0 | 0 | 0 |
| 24.08.2013 23:00 - 24:00 | 0 | 0 | 0 | 0 |
| 25.08.2013 00:00 - 01:00 | 0 | 0 | 0 | 0 |
| 25.08.2013 01:00 - 02:00 | 0 | 0 | 0 | 0 |
| 25.08.2013 02:00 - 03:00 | 0 | 0 | 0 | 0 |
| 25.08.2013 03:00 - 04:00 | 0 | 0 | 0 | 0 |
| 25.08.2013 04:00 - 05:00 | 0 | 0 | 0 | 0 |
| 25.08.2013 05:00 - 06:00 | 0 | 0 | 0 | 0 |
| 25.08.2013 06:00 - 07:00 | 0 | 0 | 0 | 0 |
| 25.08.2013 07:00 - 08:00 | 0 | 0 | 0 | 0 |
| 25.08.2013 08:00 - 09:00 | 0 | 0 | 0 | 0 |
| 25.08.2013 09:00 - 10:00 | 0 | 0 | 0 | 0 |
| 25.08.2013 10:00 - 11:00 | 0 | 0 | 0 | 0 |
| 25.08.2013 11:00 - 12:00 | 0 | 0 | 0 | 0 |
| 25.08.2013 12:00 - 13:00 | 0 | 0 | 0 | 0 |
| 25.08.2013 13:00 - 14:00 | 0 | 0 | 0 | 0 |
| 25.08.2013 14:00 - 15:00 | 0 | 0 | 0 | 0 |
| 25.08.2013 15:00 - 16:00 | 0 | 0 | 0 | 0 |
| 25.08.2013 16:00 - 17:00 | 0 | 0 | 0 | 0 |
| 25.08.2013 17:00 - 18:00 | 0 | 0 | 0 | 0 |
| 25.08.2013 18:00 - 19:00 | 0 | 0 | 0 | 0 |
| 25.08.2013 19:00 - 20:00 | 0 | 0 | 0 | 0 |
| 25.08.2013 20:00 - 21:00 | 0 | 0 | 0 | 0 |
| 25.08.2013 21:00 - 22:00 | 0 | 0 | 0 | 0 |
| 25.08.2013 22:00 - 23:00 | 0 | 0 | 0 | 0 |
| 25.08.2013 23:00 - 24:00 | 0 | 0 | 0 | 0 |
| 26.08.2013 00:00 - 01:00 | 0 | 0 | 0 | 0 |
| 26.08.2013 01:00 - 02:00 | 0 | 0 | 0 | 0 |
| 26.08.2013 02:00 - 03:00 | 0 | 0 | 0 | 0 |
| 26.08.2013 03:00 - 04:00 | 0 | 0 | 0 | 0 |
| 26.08.2013 04:00 - 05:00 | 0 | 0 | 0 | 0 |
| 26.08.2013 05:00 - 06:00 | 0 | 0 | 0 | 0 |
| 26.08.2013 06:00 - 07:00 | 0 | 0 | 0 | 0 |
| 26.08.2013 07:00 - 08:00 | 0 | 0 | 0 | 0 |
| 26.08.2013 08:00 - 09:00 | 0 | 0 | 0 | 0 |
| 26.08.2013 09:00 - 10:00 | 0 | 0 | 0 | 0 |
| 26.08.2013 10:00 - 11:00 | 0 | 0 | 0 | 0 |
| 26.08.2013 11:00 - 12:00 | 0 | 0 | 0 | 0 |
| 26.08.2013 12:00 - 13:00 | 400 | 0 | 0 | 0 |
| 26.08.2013 13:00 - 14:00 | 400 | 0 | 0 | 0 |
| 26.08.2013 14:00 - 15:00 | 400 | 0 | 0 | 0 |
| 26.08.2013 15:00 - 16:00 | 400 | 0 | 0 | 0 |
| 26.08.2013 16:00 - 17:00 | 400 | 0 | 0 | 0 |
| 26.08.2013 17:00 - 18:00 | 400 | 0 | 0 | 0 |
| 26.08.2013 18:00 - 19:00 | 400 | 0 | 0 | 0 |
| 26.08.2013 19:00 - 20:00 | 400 | 0 | 0 | 0 |
| 26.08.2013 20:00 - 21:00 | 400 | 0 | 0 | 0 |
| 26.08.2013 21:00 - 22:00 | 400 | 0 | 0 | 0 |
| 26.08.2013 22:00 - 23:00 | 400 | 0 | 0 | 0 |
| 26.08.2013 23:00 - 24:00 | 400 | 0 | 0 | 0 |
| 27.08.2013 00:00 - 01:00 | 400 | 0 | 0 | 0 |
| 27.08.2013 01:00 - 02:00 | 400 | 0 | 0 | 0 |
| 27.08.2013 02:00 - 03:00 | 400 | 0 | 0 | 0 |
| 27.08.2013 03:00 - 04:00 | 400 | 0 | 0 | 0 |
| 27.08.2013 04:00 - 05:00 | 400 | 0 | 0 | 0 |
| 27.08.2013 05:00 - 06:00 | 400 | 0 | 0 | 0 |
| 27.08.2013 06:00 - 07:00 | 0 | 0 | 0 | 0 |
| 27.08.2013 07:00 - 08:00 | 0 | 0 | 0 | 0 |
| 27.08.2013 08:00 - 09:00 | 0 | 0 | 0 | 0 |
| 27.08.2013 09:00 - 10:00 | 0 | 0 | 0 | 0 |
| 27.08.2013 10:00 - 11:00 | 0 | 0 | 0 | 0 |
| 27.08.2013 11:00 - 12:00 | 0 | 0 | 0 | 0 |
| 27.08.2013 12:00 - 13:00 | 0 | 0 | 0 | 0 |
| 27.08.2013 13:00 - 14:00 | 0 | 0 | 0 | 0 |
| 27.08.2013 14:00 - 15:00 | 0 | 0 | 0 | 0 |
| 27.08.2013 15:00 - 16:00 | 0 | 0 | 0 | 0 |
| 27.08.2013 16:00 - 17:00 | 0 | 0 | 0 | 0 |
| 27.08.2013 17:00 - 18:00 | 0 | 0 | 0 | 0 |
| 27.08.2013 18:00 - 19:00 | 0 | 0 | 0 | 0 |
| 27.08.2013 19:00 - 20:00 | 0 | 0 | 0 | 0 |
| 27.08.2013 20:00 - 21:00 | 0 | 0 | 0 | 0 |
| 27.08.2013 21:00 - 22:00 | 0 | 0 | 0 | 0 |
| 27.08.2013 22:00 - 23:00 | 0 | 0 | 0 | 0 |
| 27.08.2013 23:00 - 24:00 | 0 | 0 | 0 | 0 |
| 28.08.2013 00:00 - 01:00 | 0 | 0 | 0 | 0 |
| 28.08.2013 01:00 - 02:00 | 0 | 0 | 0 | 0 |
| 28.08.2013 02:00 - 03:00 | 0 | 0 | 0 | 0 |
| 28.08.2013 03:00 - 04:00 | 0 | 0 | 0 | 0 |
| 28.08.2013 04:00 - 05:00 | 0 | 0 | 0 | 0 |
| 28.08.2013 05:00 - 06:00 | 0 | 0 | 0 | 0 |
| 28.08.2013 06:00 - 07:00 | 0 | 0 | 0 | 0 |
| 28.08.2013 07:00 - 08:00 | 0 | 0 | 0 | 0 |
| 28.08.2013 08:00 - 09:00 | 0 | 0 | 0 | 0 |
| 28.08.2013 09:00 - 10:00 | 0 | 0 | 0 | 0 |
| 28.08.2013 10:00 - 11:00 | 0 | 0 | 0 | 0 |
| 28.08.2013 11:00 - 12:00 | 0 | 0 | 0 | 0 |
| 28.08.2013 12:00 - 13:00 | 0 | 0 | 0 | 0 |
| 28.08.2013 13:00 - 14:00 | 0 | 0 | 0 | 0 |
| 28.08.2013 14:00 - 15:00 | 0 | 0 | 0 | 0 |
| 28.08.2013 15:00 - 16:00 | 0 | 0 | 0 | 0 |
| 28.08.2013 16:00 - 17:00 | 0 | 0 | 0 | 0 |
| 28.08.2013 17:00 - 18:00 | 0 | 0 | 0 | 0 |
| 28.08.2013 18:00 - 19:00 | 0 | 0 | 0 | 0 |
| 28.08.2013 19:00 - 20:00 | 0 | 0 | 0 | 0 |
| 28.08.2013 20:00 - 21:00 | 0 | 0 | 0 | 0 |
| 28.08.2013 21:00 - 22:00 | 0 | 0 | 0 | 0 |
| 28.08.2013 22:00 - 23:00 | 0 | 0 | 0 | 0 |
| 28.08.2013 23:00 - 24:00 | 0 | 0 | 0 | 0 |
| 29.08.2013 00:00 - 01:00 | 0 | 0 | 0 | 0 |
| 29.08.2013 01:00 - 02:00 | 0 | 0 | 0 | 0 |
| 29.08.2013 02:00 - 03:00 | 0 | 0 | 0 | 0 |
| 29.08.2013 03:00 - 04:00 | 0 | 0 | 0 | 0 |
| 29.08.2013 04:00 - 05:00 | 0 | 0 | 0 | 0 |
| 29.08.2013 05:00 - 06:00 | 0 | 0 | 0 | 0 |
| 29.08.2013 06:00 - 07:00 | 0 | 0 | 0 | 0 |
| 29.08.2013 07:00 - 08:00 | 0 | 0 | 0 | 0 |
| 29.08.2013 08:00 - 09:00 | 0 | 0 | 0 | 0 |
| 29.08.2013 09:00 - 10:00 | 0 | 0 | 0 | 0 |
| 29.08.2013 10:00 - 11:00 | 0 | 0 | 0 | 0 |
| 29.08.2013 11:00 - 12:00 | 0 | 0 | 0 | 0 |
| 29.08.2013 12:00 - 13:00 | 0 | 0 | 0 | 0 |
| 29.08.2013 13:00 - 14:00 | 0 | 0 | 0 | 0 |
| 29.08.2013 14:00 - 15:00 | 0 | 0 | 0 | 0 |
| 29.08.2013 15:00 - 16:00 | 0 | 0 | 0 | 0 |
| 29.08.2013 16:00 - 17:00 | 0 | 0 | 0 | 0 |
| 29.08.2013 17:00 - 18:00 | 0 | 0 | 0 | 0 |
| 29.08.2013 18:00 - 19:00 | 0 | 0 | 0 | 0 |
| 29.08.2013 19:00 - 20:00 | 0 | 0 | 0 | 0 |
| 29.08.2013 20:00 - 21:00 | 0 | 0 | 0 | 0 |
| 29.08.2013 21:00 - 22:00 | 0 | 0 | 0 | 0 |
| 29.08.2013 22:00 - 23:00 | 0 | 0 | 0 | 0 |
| 29.08.2013 23:00 - 24:00 | 0 | 0 | 0 | 0 |
| 30.08.2013 00:00 - 01:00 | 0 | 0 | 0 | 0 |
| 30.08.2013 01:00 - 02:00 | 0 | 0 | 0 | 0 |
| 30.08.2013 02:00 - 03:00 | 0 | 0 | 0 | 0 |
| 30.08.2013 03:00 - 04:00 | 0 | 0 | 0 | 0 |
| 30.08.2013 04:00 - 05:00 | 0 | 0 | 0 | 0 |
| 30.08.2013 05:00 - 06:00 | 0 | 0 | 0 | 0 |
| 30.08.2013 06:00 - 07:00 | 0 | 0 | 0 | 0 |
| 30.08.2013 07:00 - 08:00 | 0 | 0 | 0 | 0 |
| 30.08.2013 08:00 - 09:00 | 0 | 0 | 0 | 0 |
| 30.08.2013 09:00 - 10:00 | 0 | 0 | 0 | 0 |
| 30.08.2013 10:00 - 11:00 | 0 | 0 | 0 | 0 |
| 30.08.2013 11:00 - 12:00 | 0 | 0 | 0 | 0 |
| 30.08.2013 12:00 - 13:00 | 0 | 0 | 0 | 0 |
| 30.08.2013 13:00 - 14:00 | 0 | 0 | 0 | 0 |
| 30.08.2013 14:00 - 15:00 | 0 | 0 | 0 | 0 |
| 30.08.2013 15:00 - 16:00 | 0 | 0 | 0 | 0 |
| 30.08.2013 16:00 - 17:00 | 0 | 0 | 0 | 0 |
| 30.08.2013 17:00 - 18:00 | 0 | 0 | 0 | 0 |
| 30.08.2013 18:00 - 19:00 | 0 | 0 | 0 | 0 |
| 30.08.2013 19:00 - 20:00 | 0 | 0 | 0 | 0 |
| 30.08.2013 20:00 - 21:00 | 0 | 0 | 0 | 0 |
| 30.08.2013 21:00 - 22:00 | 0 | 0 | 0 | 0 |
| 30.08.2013 22:00 - 23:00 | 0 | 0 | 0 | 0 |
| 30.08.2013 23:00 - 24:00 | 0 | 0 | 0 | 0 |
| 31.08.2013 00:00 - 01:00 | 0 | 0 | 0 | 0 |
| 31.08.2013 01:00 - 02:00 | 0 | 0 | 0 | 0 |
| 31.08.2013 02:00 - 03:00 | 0 | 0 | 0 | 0 |
| 31.08.2013 03:00 - 04:00 | 0 | 0 | 0 | 0 |
| 31.08.2013 04:00 - 05:00 | 0 | 0 | 0 | 0 |
| 31.08.2013 05:00 - 06:00 | 0 | 0 | 0 | 0 |